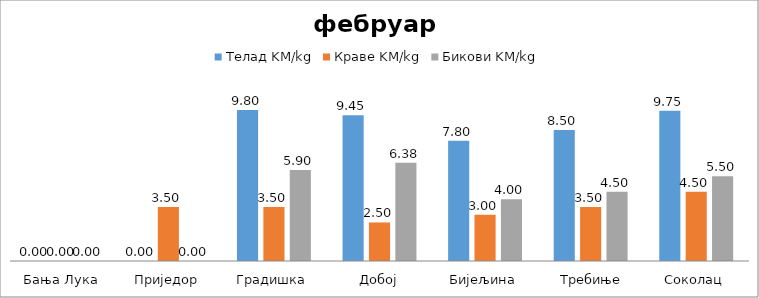
| Category | Телад KM/kg | Краве KM/kg | Бикови KM/kg |
|---|---|---|---|
| Бања Лука | 0 | 0 | 0 |
| Приједор | 0 | 3.5 | 0 |
| Градишка | 9.8 | 3.5 | 5.9 |
| Добој | 9.45 | 2.5 | 6.375 |
| Бијељина | 7.8 | 3 | 4 |
|  Требиње | 8.5 | 3.5 | 4.5 |
| Соколац | 9.75 | 4.5 | 5.5 |